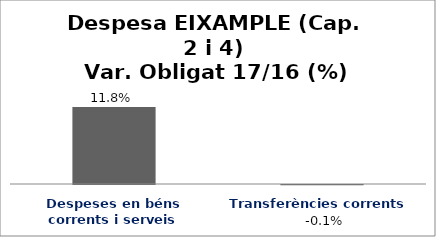
| Category | Series 0 |
|---|---|
| Despeses en béns corrents i serveis | 0.118 |
| Transferències corrents | -0.001 |